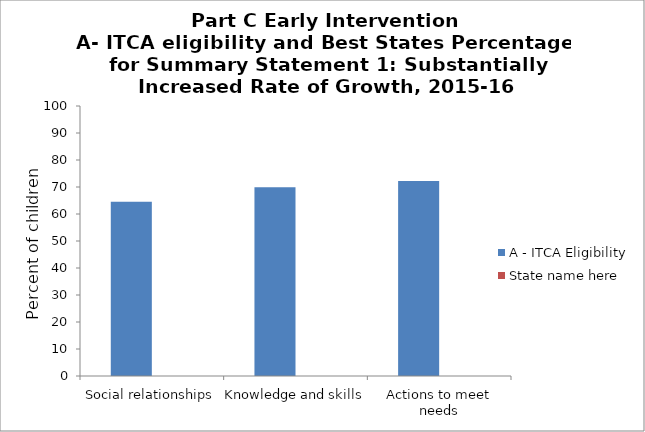
| Category | A - ITCA Eligibility | State name here |
|---|---|---|
| Social relationships | 64.5 |  |
| Knowledge and skills | 69.9 |  |
| Actions to meet needs | 72.2 |  |